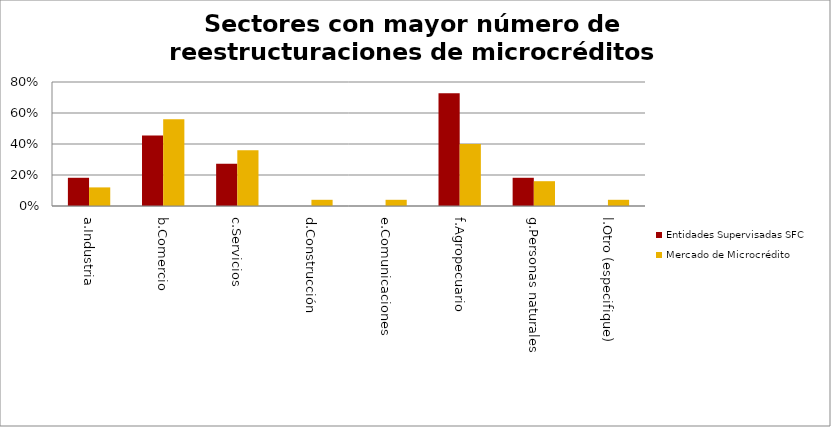
| Category | Entidades Supervisadas SFC | Mercado de Microcrédito |
|---|---|---|
| a.Industria | 0.182 | 0.12 |
| b.Comercio | 0.455 | 0.56 |
| c.Servicios | 0.273 | 0.36 |
| d.Construcción | 0 | 0.04 |
| e.Comunicaciones | 0 | 0.04 |
| f.Agropecuario | 0.727 | 0.4 |
| g.Personas naturales | 0.182 | 0.16 |
| l.Otro (especifique) | 0 | 0.04 |